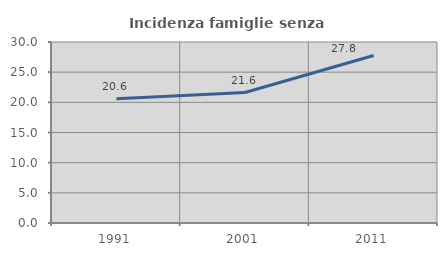
| Category | Incidenza famiglie senza nuclei |
|---|---|
| 1991.0 | 20.606 |
| 2001.0 | 21.624 |
| 2011.0 | 27.764 |